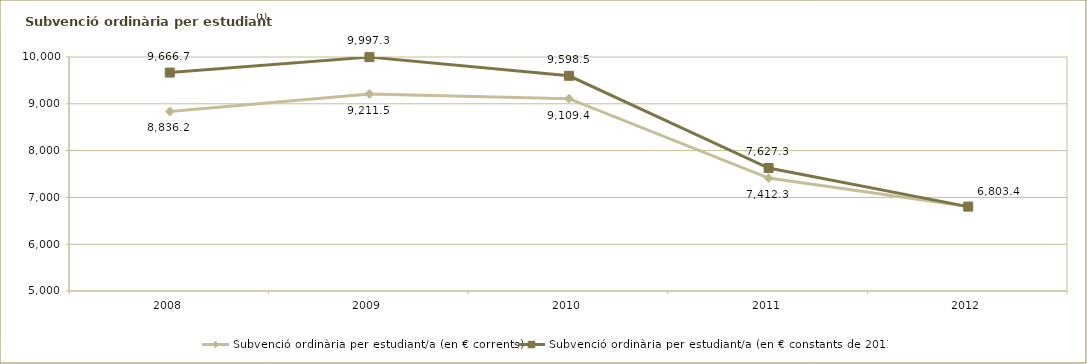
| Category | Subvenció ordinària per estudiant/a (en € corrents) | Subvenció ordinària per estudiant/a (en € constants de 2011) |
|---|---|---|
| 2008.0 | 8836.184 | 9666.691 |
| 2009.0 | 9211.491 | 9997.295 |
| 2010.0 | 9109.353 | 9598.488 |
| 2011.0 | 7412.295 | 7627.252 |
| 2012.0 | 6803.37 | 6803.37 |